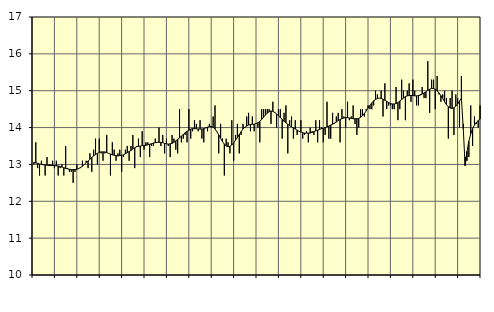
| Category | Piggar | Handel, SNI 45-47 |
|---|---|---|
| nan | 13 | 13.06 |
| 1.0 | 13.6 | 13.04 |
| 1.0 | 12.9 | 13.03 |
| 1.0 | 12.7 | 13.01 |
| 1.0 | 13.1 | 13 |
| 1.0 | 13 | 12.99 |
| 1.0 | 12.7 | 12.99 |
| 1.0 | 13.2 | 12.98 |
| 1.0 | 13 | 12.97 |
| 1.0 | 13 | 12.97 |
| 1.0 | 13.1 | 12.97 |
| 1.0 | 12.9 | 12.97 |
| nan | 13.1 | 12.96 |
| 2.0 | 12.7 | 12.96 |
| 2.0 | 12.9 | 12.94 |
| 2.0 | 13 | 12.93 |
| 2.0 | 12.7 | 12.91 |
| 2.0 | 13.5 | 12.89 |
| 2.0 | 12.9 | 12.88 |
| 2.0 | 12.8 | 12.87 |
| 2.0 | 12.8 | 12.86 |
| 2.0 | 12.5 | 12.86 |
| 2.0 | 12.8 | 12.86 |
| 2.0 | 13 | 12.87 |
| nan | 12.9 | 12.89 |
| 3.0 | 12.9 | 12.92 |
| 3.0 | 13.1 | 12.95 |
| 3.0 | 13 | 13 |
| 3.0 | 13.1 | 13.05 |
| 3.0 | 12.9 | 13.09 |
| 3.0 | 13.3 | 13.14 |
| 3.0 | 12.8 | 13.19 |
| 3.0 | 13.4 | 13.23 |
| 3.0 | 13.7 | 13.27 |
| 3.0 | 13 | 13.3 |
| 3.0 | 13.7 | 13.33 |
| nan | 13.3 | 13.34 |
| 4.0 | 13.1 | 13.34 |
| 4.0 | 13.3 | 13.34 |
| 4.0 | 13.8 | 13.32 |
| 4.0 | 13.3 | 13.3 |
| 4.0 | 12.7 | 13.28 |
| 4.0 | 13.6 | 13.26 |
| 4.0 | 13.4 | 13.25 |
| 4.0 | 13.1 | 13.24 |
| 4.0 | 13.3 | 13.23 |
| 4.0 | 13.4 | 13.24 |
| 4.0 | 12.8 | 13.25 |
| nan | 13.2 | 13.26 |
| 5.0 | 13.4 | 13.29 |
| 5.0 | 13.5 | 13.32 |
| 5.0 | 13.1 | 13.35 |
| 5.0 | 13.5 | 13.38 |
| 5.0 | 13.8 | 13.42 |
| 5.0 | 12.9 | 13.45 |
| 5.0 | 13.5 | 13.48 |
| 5.0 | 13.7 | 13.49 |
| 5.0 | 13.2 | 13.5 |
| 5.0 | 13.9 | 13.51 |
| 5.0 | 13.4 | 13.51 |
| nan | 13.6 | 13.52 |
| 6.0 | 13.6 | 13.53 |
| 6.0 | 13.2 | 13.55 |
| 6.0 | 13.5 | 13.56 |
| 6.0 | 13.5 | 13.58 |
| 6.0 | 13.7 | 13.59 |
| 6.0 | 13.6 | 13.6 |
| 6.0 | 14 | 13.6 |
| 6.0 | 13.5 | 13.6 |
| 6.0 | 13.8 | 13.59 |
| 6.0 | 13.3 | 13.57 |
| 6.0 | 13.7 | 13.56 |
| nan | 13.5 | 13.55 |
| 7.0 | 13.2 | 13.56 |
| 7.0 | 13.8 | 13.57 |
| 7.0 | 13.7 | 13.6 |
| 7.0 | 13.4 | 13.64 |
| 7.0 | 13.3 | 13.68 |
| 7.0 | 14.5 | 13.72 |
| 7.0 | 13.6 | 13.77 |
| 7.0 | 13.7 | 13.81 |
| 7.0 | 13.8 | 13.86 |
| 7.0 | 13.6 | 13.9 |
| 7.0 | 14.5 | 13.93 |
| nan | 13.7 | 13.96 |
| 8.0 | 13.9 | 13.97 |
| 8.0 | 14.2 | 13.97 |
| 8.0 | 14.1 | 13.97 |
| 8.0 | 13.9 | 13.96 |
| 8.0 | 14.2 | 13.96 |
| 8.0 | 13.7 | 13.96 |
| 8.0 | 13.6 | 13.97 |
| 8.0 | 14 | 13.99 |
| 8.0 | 13.9 | 14.01 |
| 8.0 | 14.1 | 14.03 |
| 8.0 | 14 | 14.03 |
| nan | 14.3 | 14.01 |
| 9.0 | 14.6 | 13.96 |
| 9.0 | 13.9 | 13.89 |
| 9.0 | 13.3 | 13.8 |
| 9.0 | 14.1 | 13.71 |
| 9.0 | 13.7 | 13.62 |
| 9.0 | 12.7 | 13.55 |
| 9.0 | 13.7 | 13.5 |
| 9.0 | 13.6 | 13.48 |
| 9.0 | 13.3 | 13.49 |
| 9.0 | 14.2 | 13.53 |
| 9.0 | 13.1 | 13.58 |
| nan | 13.8 | 13.66 |
| 10.0 | 14.1 | 13.73 |
| 10.0 | 13.3 | 13.81 |
| 10.0 | 13.8 | 13.89 |
| 10.0 | 14.1 | 13.96 |
| 10.0 | 14 | 14.01 |
| 10.0 | 14.3 | 14.04 |
| 10.0 | 14.4 | 14.07 |
| 10.0 | 13.9 | 14.08 |
| 10.0 | 14.3 | 14.09 |
| 10.0 | 13.9 | 14.09 |
| 10.0 | 14.1 | 14.11 |
| nan | 14 | 14.13 |
| 11.0 | 13.6 | 14.17 |
| 11.0 | 14.5 | 14.22 |
| 11.0 | 14.5 | 14.28 |
| 11.0 | 14.5 | 14.34 |
| 11.0 | 14.5 | 14.39 |
| 11.0 | 14.5 | 14.43 |
| 11.0 | 14.1 | 14.45 |
| 11.0 | 14.7 | 14.44 |
| 11.0 | 14.4 | 14.41 |
| 11.0 | 14 | 14.37 |
| 11.0 | 14.5 | 14.32 |
| nan | 14.5 | 14.27 |
| 12.0 | 13.7 | 14.22 |
| 12.0 | 14.4 | 14.17 |
| 12.0 | 14.6 | 14.13 |
| 12.0 | 13.3 | 14.09 |
| 12.0 | 14.2 | 14.05 |
| 12.0 | 14.3 | 14.02 |
| 12.0 | 13.7 | 13.99 |
| 12.0 | 14.2 | 13.96 |
| 12.0 | 13.8 | 13.93 |
| 12.0 | 13.9 | 13.9 |
| 12.0 | 14.2 | 13.88 |
| nan | 13.7 | 13.86 |
| 13.0 | 13.8 | 13.85 |
| 13.0 | 13.9 | 13.85 |
| 13.0 | 13.6 | 13.85 |
| 13.0 | 14 | 13.85 |
| 13.0 | 13.9 | 13.87 |
| 13.0 | 13.8 | 13.89 |
| 13.0 | 14.2 | 13.91 |
| 13.0 | 13.6 | 13.93 |
| 13.0 | 14.2 | 13.95 |
| 13.0 | 14 | 13.97 |
| 13.0 | 13.6 | 13.98 |
| nan | 13.8 | 14 |
| 14.0 | 14.7 | 14.02 |
| 14.0 | 13.7 | 14.04 |
| 14.0 | 13.7 | 14.07 |
| 14.0 | 14.4 | 14.09 |
| 14.0 | 14.1 | 14.12 |
| 14.0 | 14.3 | 14.15 |
| 14.0 | 14.4 | 14.19 |
| 14.0 | 13.6 | 14.22 |
| 14.0 | 14.5 | 14.24 |
| 14.0 | 14.3 | 14.26 |
| 14.0 | 14 | 14.27 |
| nan | 14.7 | 14.27 |
| 15.0 | 14.2 | 14.26 |
| 15.0 | 14.3 | 14.25 |
| 15.0 | 14.6 | 14.24 |
| 15.0 | 14.1 | 14.24 |
| 15.0 | 13.8 | 14.24 |
| 15.0 | 14 | 14.25 |
| 15.0 | 14.5 | 14.28 |
| 15.0 | 14.5 | 14.32 |
| 15.0 | 14.3 | 14.38 |
| 15.0 | 14.5 | 14.45 |
| 15.0 | 14.6 | 14.53 |
| nan | 14.5 | 14.6 |
| 16.0 | 14.5 | 14.67 |
| 16.0 | 14.6 | 14.73 |
| 16.0 | 15 | 14.76 |
| 16.0 | 14.9 | 14.79 |
| 16.0 | 14.8 | 14.8 |
| 16.0 | 15 | 14.79 |
| 16.0 | 14.3 | 14.77 |
| 16.0 | 15.2 | 14.74 |
| 16.0 | 14.5 | 14.71 |
| 16.0 | 14.6 | 14.68 |
| 16.0 | 14.6 | 14.65 |
| nan | 14.5 | 14.64 |
| 17.0 | 14.5 | 14.64 |
| 17.0 | 15.1 | 14.65 |
| 17.0 | 14.2 | 14.68 |
| 17.0 | 14.5 | 14.72 |
| 17.0 | 15.3 | 14.76 |
| 17.0 | 15 | 14.8 |
| 17.0 | 14.2 | 14.84 |
| 17.0 | 15 | 14.86 |
| 17.0 | 15.2 | 14.87 |
| 17.0 | 14.7 | 14.87 |
| 17.0 | 15.3 | 14.87 |
| nan | 15 | 14.86 |
| 18.0 | 14.6 | 14.86 |
| 18.0 | 14.6 | 14.87 |
| 18.0 | 14.9 | 14.88 |
| 18.0 | 15.1 | 14.91 |
| 18.0 | 14.8 | 14.94 |
| 18.0 | 14.8 | 14.97 |
| 18.0 | 15.8 | 15.01 |
| 18.0 | 14.4 | 15.04 |
| 18.0 | 15.3 | 15.06 |
| 18.0 | 15.3 | 15.06 |
| 18.0 | 14.5 | 15.04 |
| nan | 15.4 | 15 |
| 19.0 | 14.9 | 14.94 |
| 19.0 | 14.7 | 14.87 |
| 19.0 | 14.9 | 14.79 |
| 19.0 | 15 | 14.7 |
| 19.0 | 14.8 | 14.62 |
| 19.0 | 13.7 | 14.57 |
| 19.0 | 14.8 | 14.53 |
| 19.0 | 15 | 14.52 |
| 19.0 | 13.8 | 14.54 |
| 19.0 | 14.9 | 14.58 |
| 19.0 | 14.8 | 14.64 |
| nan | 14 | 14.72 |
| 20.0 | 15.4 | 14.8 |
| 20.0 | 14.1 | 13.97 |
| 20.0 | 13.2 | 12.97 |
| 20.0 | 13.1 | 13.35 |
| 20.0 | 13.2 | 13.63 |
| 20.0 | 14.6 | 13.83 |
| 20.0 | 13.5 | 13.97 |
| 20.0 | 14.3 | 14.07 |
| 20.0 | 14.1 | 14.14 |
| 20.0 | 14 | 14.19 |
| 20.0 | 14.6 | 14.23 |